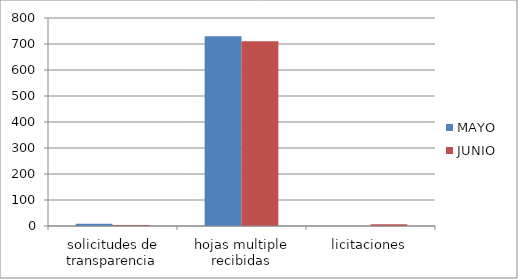
| Category | MAYO | JUNIO  |
|---|---|---|
| solicitudes de transparencia | 9 | 4 |
| hojas multiple recibidas | 730 | 711 |
| licitaciones | 0 | 7 |